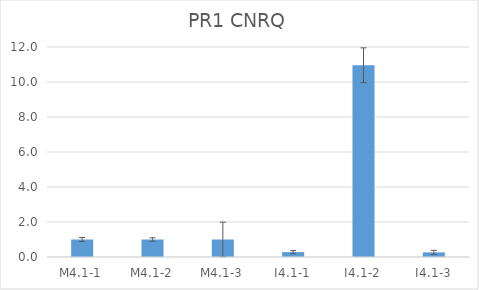
| Category | PR1 CNRQ |
|---|---|
| M4.1-1 | 1 |
| M4.1-2 | 1 |
| M4.1-3 | 1 |
| I4.1-1 | 0.279 |
| I4.1-2 | 10.957 |
| I4.1-3 | 0.266 |